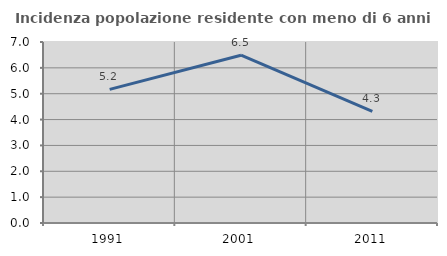
| Category | Incidenza popolazione residente con meno di 6 anni |
|---|---|
| 1991.0 | 5.167 |
| 2001.0 | 6.489 |
| 2011.0 | 4.32 |